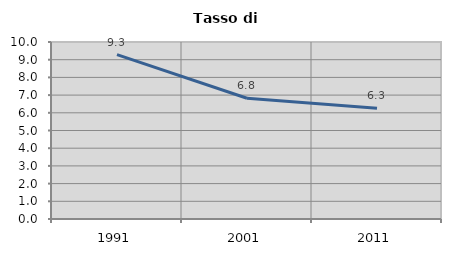
| Category | Tasso di disoccupazione   |
|---|---|
| 1991.0 | 9.289 |
| 2001.0 | 6.82 |
| 2011.0 | 6.255 |